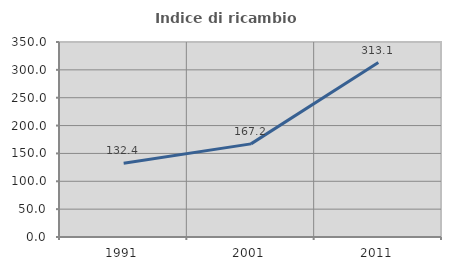
| Category | Indice di ricambio occupazionale  |
|---|---|
| 1991.0 | 132.402 |
| 2001.0 | 167.164 |
| 2011.0 | 313.131 |